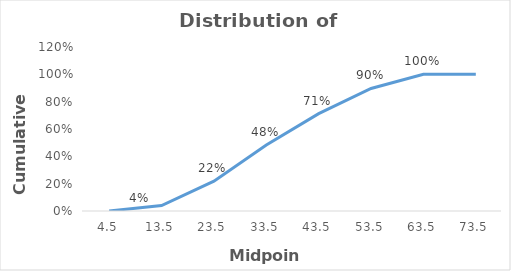
| Category | Series 0 |
|---|---|
| 4.5 | 0 |
| 13.5 | 0.04 |
| 23.5 | 0.218 |
| 33.5 | 0.483 |
| 43.5 | 0.713 |
| 53.5 | 0.897 |
| 63.5 | 1 |
| 73.5 | 1 |